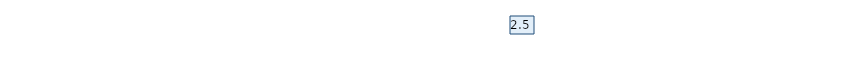
| Category | Итоговая оценка |
|---|---|
| Вопрос 5 | 2.5 |